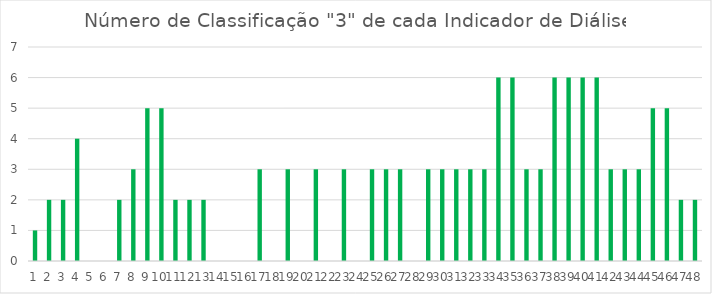
| Category | Series 0 |
|---|---|
| 0 | 1 |
| 1 | 2 |
| 2 | 2 |
| 3 | 4 |
| 4 | 0 |
| 5 | 0 |
| 6 | 2 |
| 7 | 3 |
| 8 | 5 |
| 9 | 5 |
| 10 | 2 |
| 11 | 2 |
| 12 | 2 |
| 13 | 0 |
| 14 | 0 |
| 15 | 0 |
| 16 | 3 |
| 17 | 0 |
| 18 | 3 |
| 19 | 0 |
| 20 | 3 |
| 21 | 0 |
| 22 | 3 |
| 23 | 0 |
| 24 | 3 |
| 25 | 3 |
| 26 | 3 |
| 27 | 0 |
| 28 | 3 |
| 29 | 3 |
| 30 | 3 |
| 31 | 3 |
| 32 | 3 |
| 33 | 6 |
| 34 | 6 |
| 35 | 3 |
| 36 | 3 |
| 37 | 6 |
| 38 | 6 |
| 39 | 6 |
| 40 | 6 |
| 41 | 3 |
| 42 | 3 |
| 43 | 3 |
| 44 | 5 |
| 45 | 5 |
| 46 | 2 |
| 47 | 2 |